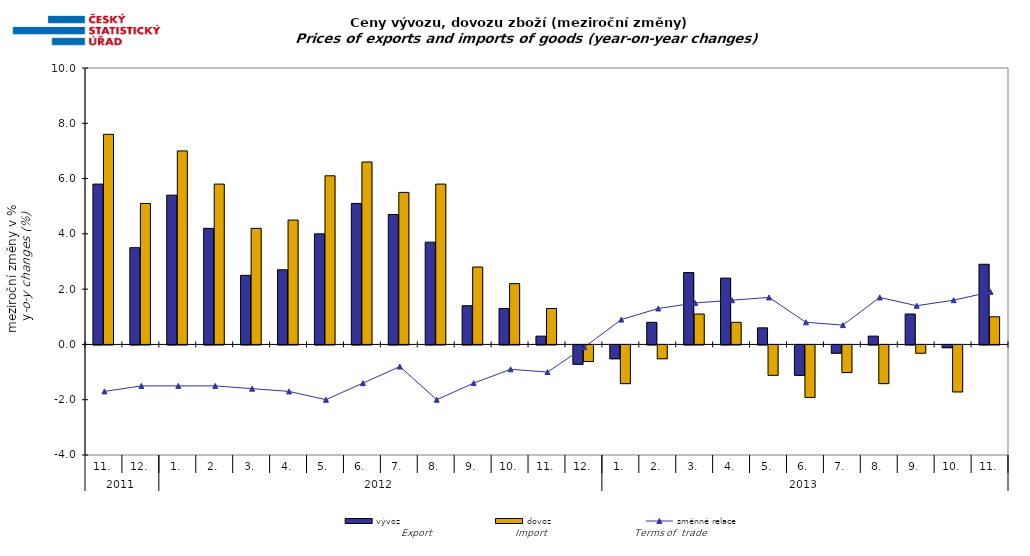
| Category | vývoz | dovoz |
|---|---|---|
| 0 | 5.8 | 7.6 |
| 1 | 3.5 | 5.1 |
| 2 | 5.4 | 7 |
| 3 | 4.2 | 5.8 |
| 4 | 2.5 | 4.2 |
| 5 | 2.7 | 4.5 |
| 6 | 4 | 6.1 |
| 7 | 5.1 | 6.6 |
| 8 | 4.7 | 5.5 |
| 9 | 3.7 | 5.8 |
| 10 | 1.4 | 2.8 |
| 11 | 1.3 | 2.2 |
| 12 | 0.3 | 1.3 |
| 13 | -0.7 | -0.6 |
| 14 | -0.5 | -1.4 |
| 15 | 0.8 | -0.5 |
| 16 | 2.6 | 1.1 |
| 17 | 2.4 | 0.8 |
| 18 | 0.6 | -1.1 |
| 19 | -1.1 | -1.9 |
| 20 | -0.3 | -1 |
| 21 | 0.3 | -1.4 |
| 22 | 1.1 | -0.3 |
| 23 | -0.1 | -1.7 |
| 24 | 2.9 | 1 |